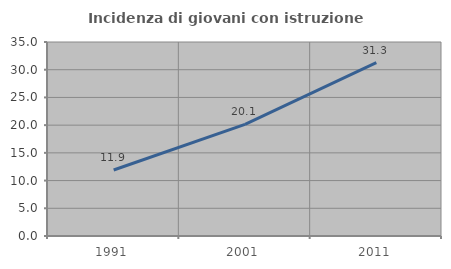
| Category | Incidenza di giovani con istruzione universitaria |
|---|---|
| 1991.0 | 11.909 |
| 2001.0 | 20.138 |
| 2011.0 | 31.261 |